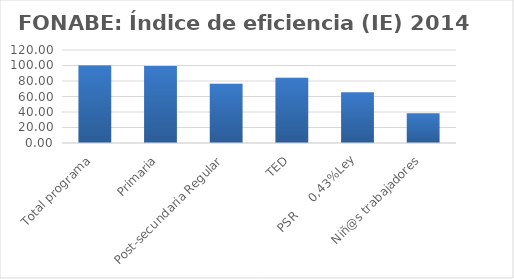
| Category | Índice de eficiencia (IE)  |
|---|---|
| Total programa | 99.89 |
| Primaria | 99.358 |
| Post-secundaria Regular | 76.444 |
| TED | 84.04 |
| PSR     0,43%Ley | 65.457 |
| Niñ@s trabajadores | 38.409 |